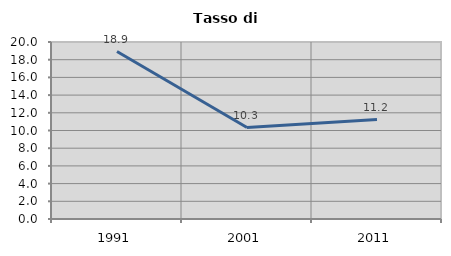
| Category | Tasso di disoccupazione   |
|---|---|
| 1991.0 | 18.919 |
| 2001.0 | 10.331 |
| 2011.0 | 11.241 |